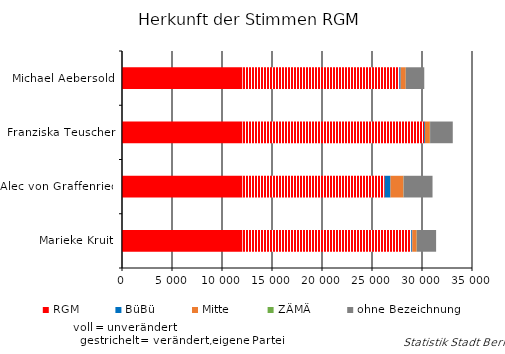
| Category | RGM | verändert, eigene Liste | BüBü | Mitte | ZÄMÄ | ohne Bezeichnung |
|---|---|---|---|---|---|---|
| Michael Aebersold | 12052 | 15682 | 128 | 513 | 10 | 1842 |
| Franziska Teuscher | 12052 | 18148 | 89 | 496 | 26 | 2266 |
| Alec von Graffenried | 12052 | 14222 | 575 | 1300 | 13 | 2891 |
| Marieke Kruit | 12052 | 16872 | 103 | 441 | 15 | 1928 |